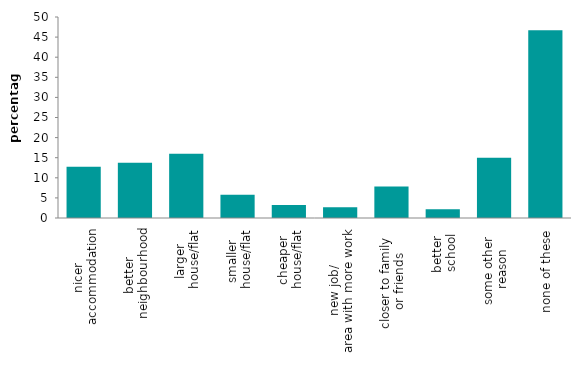
| Category | Series 0 |
|---|---|
| nicer 
accommodation | 12.73 |
| better 
neighbourhood | 13.754 |
| larger 
house/flat | 15.991 |
| smaller 
house/flat | 5.769 |
| cheaper 
house/flat | 3.235 |
| new job/
area with more work | 2.646 |
| closer to family 
or friends | 7.854 |
| better 
school | 2.179 |
| some other 
reason | 14.981 |
| none of these | 46.704 |